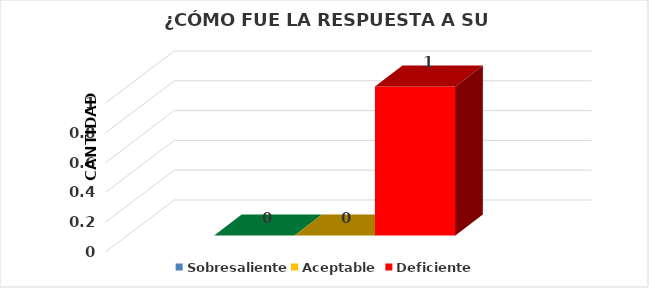
| Category | Sobresaliente | Aceptable  | Deficiente |
|---|---|---|---|
| 0 | 0 | 0 | 1 |